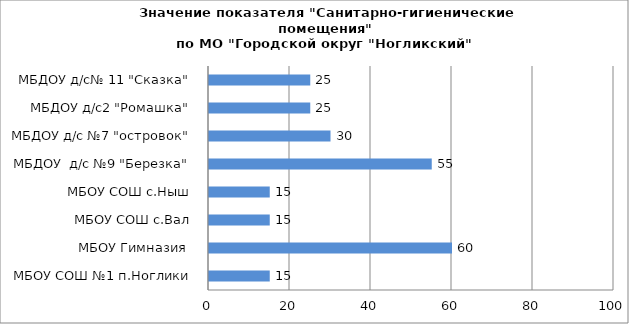
| Category | Series 0 |
|---|---|
| МБОУ СОШ №1 п.Ноглики | 15 |
| МБОУ Гимназия  | 60 |
| МБОУ СОШ с.Вал | 15 |
| МБОУ СОШ с.Ныш | 15 |
| МБДОУ  д/с №9 "Березка" | 55 |
| МБДОУ д/с №7 "островок" | 30 |
| МБДОУ д/с2 "Ромашка" | 25 |
| МБДОУ д/с№ 11 "Сказка" | 25 |